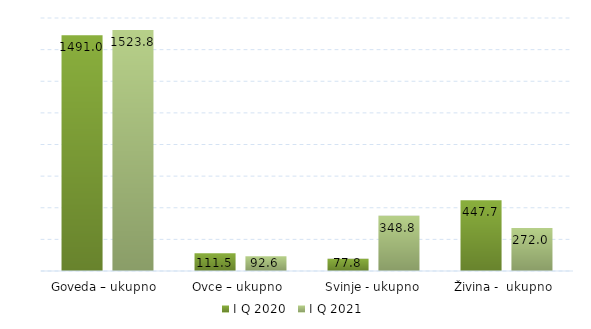
| Category | I Q 2020 | I Q 2021 |
|---|---|---|
| Goveda – ukupno  | 1491 | 1523.8 |
| Ovce – ukupno  | 111.5 | 92.619 |
| Svinje - ukupno | 77.8 | 348.838 |
| Živina -  ukupno  | 447.7 | 271.951 |